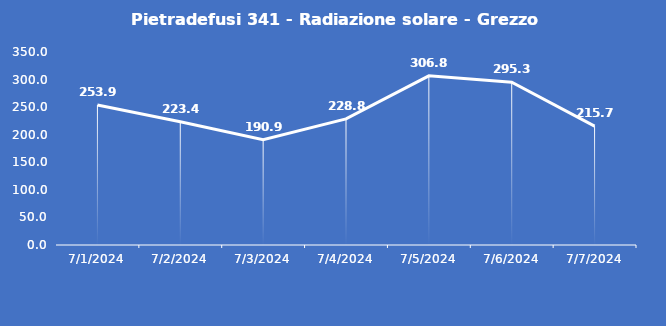
| Category | Pietradefusi 341 - Radiazione solare - Grezzo (W/m2) |
|---|---|
| 7/1/24 | 253.9 |
| 7/2/24 | 223.4 |
| 7/3/24 | 190.9 |
| 7/4/24 | 228.8 |
| 7/5/24 | 306.8 |
| 7/6/24 | 295.3 |
| 7/7/24 | 215.7 |